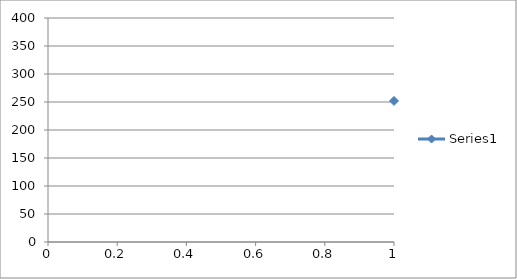
| Category | Series 0 |
|---|---|
| 0 | 251.9 |
| 1 | 251.9 |
| 2 | 38.4 |
| 3 | 31.5 |
| 4 | 354.7 |
| 5 | 324.5 |
| 6 | 331.2 |
| 7 | 14.4 |
| 8 | 35.6 |
| 9 | 14.3 |
| 10 | 332.7 |
| 11 | 326.4 |
| 12 | 354.3 |
| 13 | 26.5 |
| 14 | 23.3 |
| 15 | 347.8 |
| 16 | 324.8 |
| 17 | 342.4 |